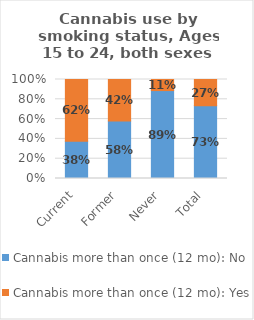
| Category | Cannabis more than once (12 mo): No | Cannabis more than once (12 mo): Yes |
|---|---|---|
| Current | 0.376 | 0.624 |
| Former | 0.582 | 0.418 |
| Never | 0.888 | 0.112 |
| Total | 0.735 | 0.265 |